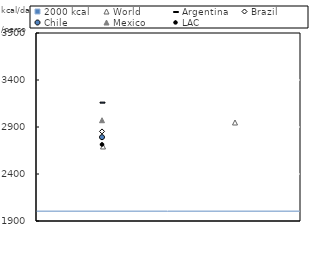
| Category | 2000 kcal |
|---|---|
| 0 | 3 |
| 1 | 3 |